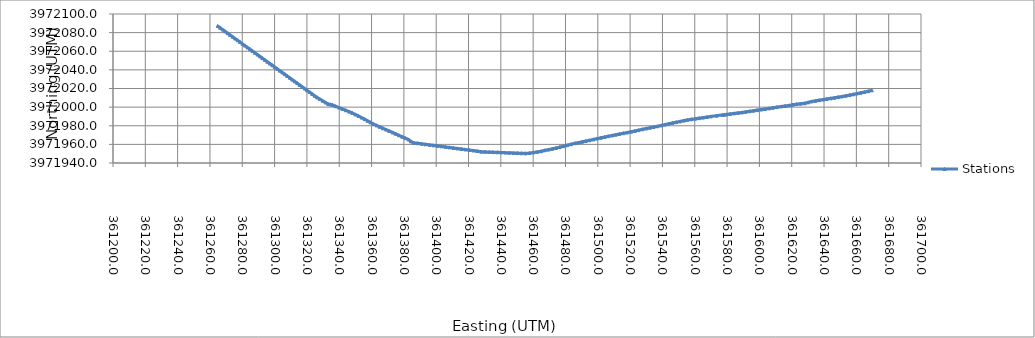
| Category | Stations |
|---|---|
| 361669.6 | 3972018.062 |
| 361667.3 | 3972017.112 |
| 361664.9 | 3972016.161 |
| 361662.6 | 3972015.402 |
| 361660.3 | 3972014.643 |
| 361658.1 | 3972013.801 |
| 361655.8 | 3972012.959 |
| 361653.4 | 3972012.204 |
| 361651.0 | 3972011.45 |
| 361648.7 | 3972010.782 |
| 361646.4 | 3972010.114 |
| 361644.1 | 3972009.471 |
| 361641.7 | 3972008.827 |
| 361639.4 | 3972008.155 |
| 361637.0 | 3972007.484 |
| 361634.7 | 3972006.812 |
| 361632.3 | 3972006.141 |
| 361630.1 | 3972005.146 |
| 361628.0 | 3972004.152 |
| 361625.5 | 3972003.711 |
| 361623.0 | 3972003.27 |
| 361620.6 | 3972002.552 |
| 361618.2 | 3972001.833 |
| 361615.8 | 3972001.267 |
| 361613.3 | 3972000.7 |
| 361610.8 | 3972000.019 |
| 361608.3 | 3971999.338 |
| 361605.9 | 3971998.69 |
| 361603.5 | 3971998.041 |
| 361601.1 | 3971997.423 |
| 361598.6 | 3971996.804 |
| 361596.3 | 3971996.198 |
| 361594.0 | 3971995.592 |
| 361591.5 | 3971994.941 |
| 361589.1 | 3971994.29 |
| 361586.7 | 3971993.79 |
| 361584.3 | 3971993.289 |
| 361581.9 | 3971992.731 |
| 361579.5 | 3971992.174 |
| 361578.3 | 3971991.907 |
| 361577.1 | 3971991.639 |
| 361573.5 | 3971990.837 |
| 361569.9 | 3971990.034 |
| 361567.5 | 3971989.392 |
| 361565.1 | 3971988.75 |
| 361562.7 | 3971988.159 |
| 361560.3 | 3971987.569 |
| 361557.9 | 3971986.97 |
| 361555.5 | 3971986.371 |
| 361553.2 | 3971985.517 |
| 361550.8 | 3971984.662 |
| 361548.5 | 3971983.852 |
| 361546.2 | 3971983.041 |
| 361543.8 | 3971982.147 |
| 361541.5 | 3971981.252 |
| 361539.2 | 3971980.358 |
| 361536.9 | 3971979.463 |
| 361534.5 | 3971978.697 |
| 361532.2 | 3971977.931 |
| 361529.9 | 3971977.086 |
| 361527.6 | 3971976.24 |
| 361525.2 | 3971975.329 |
| 361522.9 | 3971974.418 |
| 361520.5 | 3971973.595 |
| 361518.2 | 3971972.772 |
| 361515.8 | 3971971.991 |
| 361513.4 | 3971971.211 |
| 361511.1 | 3971970.404 |
| 361508.8 | 3971969.598 |
| 361506.5 | 3971968.771 |
| 361504.2 | 3971967.945 |
| 361501.9 | 3971967.111 |
| 361499.6 | 3971966.276 |
| 361497.2 | 3971965.351 |
| 361494.9 | 3971964.425 |
| 361492.5 | 3971963.568 |
| 361490.2 | 3971962.71 |
| 361488.1 | 3971961.98 |
| 361485.9 | 3971961.249 |
| 361483.4 | 3971960.166 |
| 361481.0 | 3971959.083 |
| 361478.7 | 3971958.083 |
| 361476.4 | 3971957.073 |
| 361474.1 | 3971956.119 |
| 361471.8 | 3971955.222 |
| 361469.4 | 3971954.385 |
| 361467.0 | 3971953.609 |
| 361464.9 | 3971952.617 |
| 361462.5 | 3971951.974 |
| 361460.1 | 3971951.331 |
| 361457.7 | 3971950.713 |
| 361455.2 | 3971950.33 |
| 361452.7 | 3971950.497 |
| 361450.2 | 3971950.664 |
| 361447.8 | 3971950.831 |
| 361445.2 | 3971950.998 |
| 361442.8 | 3971951.165 |
| 361440.3 | 3971951.332 |
| 361437.8 | 3971951.499 |
| 361435.3 | 3971951.665 |
| 361432.8 | 3971951.832 |
| 361430.3 | 3971951.999 |
| 361427.9 | 3971952.166 |
| 361425.4 | 3971952.867 |
| 361423.0 | 3971953.424 |
| 361420.5 | 3971953.981 |
| 361418.1 | 3971954.538 |
| 361415.6 | 3971955.095 |
| 361413.1 | 3971955.652 |
| 361410.7 | 3971956.209 |
| 361408.2 | 3971956.766 |
| 361405.8 | 3971957.322 |
| 361403.3 | 3971957.879 |
| 361400.8 | 3971958.436 |
| 361398.3 | 3971958.993 |
| 361395.9 | 3971959.55 |
| 361393.4 | 3971960.107 |
| 361391.0 | 3971960.664 |
| 361388.5 | 3971961.221 |
| 361386.0 | 3971961.777 |
| 361384.3 | 3971963.238 |
| 361382.9 | 3971965.246 |
| 361380.9 | 3971966.764 |
| 361378.9 | 3971968.281 |
| 361376.9 | 3971969.799 |
| 361375.0 | 3971971.316 |
| 361373.0 | 3971972.834 |
| 361371.0 | 3971974.352 |
| 361369.0 | 3971975.869 |
| 361367.0 | 3971977.387 |
| 361365.0 | 3971978.905 |
| 361363.1 | 3971980.422 |
| 361361.1 | 3971981.968 |
| 361359.3 | 3971983.69 |
| 361357.5 | 3971985.411 |
| 361355.7 | 3971987.133 |
| 361353.8 | 3971988.835 |
| 361351.9 | 3971990.524 |
| 361350.0 | 3971992.156 |
| 361348.1 | 3971993.762 |
| 361346.1 | 3971995.243 |
| 361344.0 | 3971996.672 |
| 361342.0 | 3971998.098 |
| 361339.9 | 3971999.522 |
| 361337.8 | 3972000.965 |
| 361335.8 | 3972002.418 |
| 361334.4 | 3972002.968 |
| 361333.2 | 3972003.263 |
| 361331.5 | 3972005.031 |
| 361329.8 | 3972006.837 |
| 361328.0 | 3972008.643 |
| 361326.3 | 3972010.449 |
| 361324.7 | 3972012.308 |
| 361323.2 | 3972014.241 |
| 361321.7 | 3972016.161 |
| 361320.1 | 3972018.08 |
| 361318.6 | 3972020 |
| 361317.1 | 3972021.919 |
| 361315.5 | 3972023.839 |
| 361314.0 | 3972025.758 |
| 361312.4 | 3972027.678 |
| 361310.9 | 3972029.597 |
| 361309.4 | 3972031.516 |
| 361307.8 | 3972033.436 |
| 361306.3 | 3972035.355 |
| 361304.8 | 3972037.275 |
| 361303.2 | 3972039.194 |
| 361301.7 | 3972041.114 |
| 361300.1 | 3972043.033 |
| 361298.6 | 3972044.953 |
| 361297.1 | 3972046.872 |
| 361295.5 | 3972048.792 |
| 361294.0 | 3972050.711 |
| 361292.4 | 3972052.63 |
| 361290.9 | 3972054.55 |
| 361289.4 | 3972056.469 |
| 361287.8 | 3972058.389 |
| 361286.3 | 3972060.308 |
| 361284.8 | 3972062.228 |
| 361283.2 | 3972064.147 |
| 361281.7 | 3972066.067 |
| 361280.1 | 3972067.986 |
| 361278.6 | 3972069.905 |
| 361277.1 | 3972071.825 |
| 361275.5 | 3972073.744 |
| 361274.0 | 3972075.664 |
| 361272.4 | 3972077.583 |
| 361270.9 | 3972079.503 |
| 361269.4 | 3972081.422 |
| 361267.8 | 3972083.342 |
| 361266.3 | 3972085.261 |
| 361264.8 | 3972087.181 |